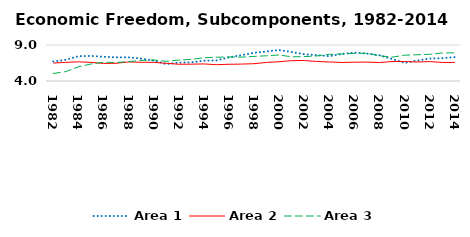
| Category | Area 1 | Area 2 | Area 3 |
|---|---|---|---|
| 1982.0 | 6.72 | 6.491 | 5.043 |
| 1983.0 | 6.943 | 6.586 | 5.307 |
| 1984.0 | 7.445 | 6.666 | 5.978 |
| 1985.0 | 7.484 | 6.586 | 6.356 |
| 1986.0 | 7.364 | 6.441 | 6.603 |
| 1987.0 | 7.284 | 6.459 | 6.577 |
| 1988.0 | 7.288 | 6.646 | 6.694 |
| 1989.0 | 7.12 | 6.6 | 6.856 |
| 1990.0 | 6.83 | 6.589 | 6.924 |
| 1991.0 | 6.353 | 6.457 | 6.734 |
| 1992.0 | 6.563 | 6.331 | 6.908 |
| 1993.0 | 6.593 | 6.337 | 6.997 |
| 1994.0 | 6.811 | 6.37 | 7.238 |
| 1995.0 | 6.853 | 6.265 | 7.301 |
| 1996.0 | 7.296 | 6.323 | 7.336 |
| 1997.0 | 7.587 | 6.348 | 7.32 |
| 1998.0 | 7.918 | 6.403 | 7.416 |
| 1999.0 | 8.095 | 6.576 | 7.502 |
| 2000.0 | 8.309 | 6.678 | 7.617 |
| 2001.0 | 8.017 | 6.826 | 7.355 |
| 2002.0 | 7.726 | 6.848 | 7.388 |
| 2003.0 | 7.587 | 6.708 | 7.48 |
| 2004.0 | 7.448 | 6.643 | 7.704 |
| 2005.0 | 7.749 | 6.574 | 7.757 |
| 2006.0 | 7.951 | 6.61 | 7.833 |
| 2007.0 | 7.801 | 6.624 | 7.858 |
| 2008.0 | 7.568 | 6.568 | 7.507 |
| 2009.0 | 7.058 | 6.702 | 7.308 |
| 2010.0 | 6.525 | 6.708 | 7.587 |
| 2011.0 | 6.828 | 6.641 | 7.646 |
| 2012.0 | 7.123 | 6.698 | 7.705 |
| 2013.0 | 7.156 | 6.574 | 7.893 |
| 2014.0 | 7.32 | 6.578 | 7.91 |